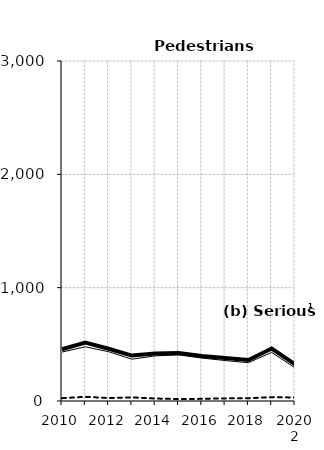
| Category | Built-up | Non built-up | Total |
|---|---|---|---|
| 2010 | 432 | 25 | 457 |
| 2011 | 478 | 37 | 515 |
| 2012 | 435 | 26 | 461 |
| 2013 | 369 | 32 | 401 |
| 2014 | 398 | 22 | 420 |
| 2015 | 407 | 17 | 424 |
| 2016 | 379 | 19 | 398 |
| 2017 | 357 | 23 | 380 |
| 2018 | 338 | 24 | 362 |
| 2019 2 | 429 | 34 | 463 |
| 2020 2 | 292 | 31 | 323 |